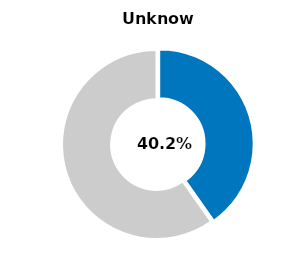
| Category | Series 0 |
|---|---|
| Unknown | 0.402 |
| Other | 0.598 |